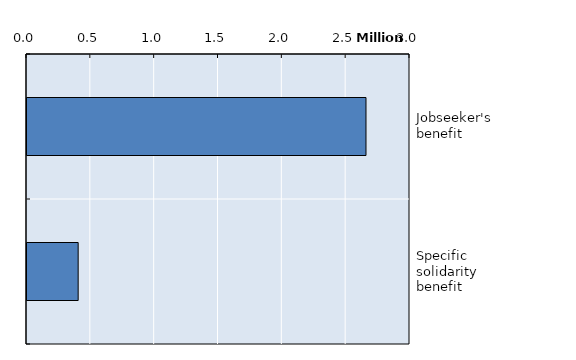
| Category | Series 0 |
|---|---|
| Jobseeker's benefit | 2655251.583 |
| Specific solidarity benefit | 400766 |